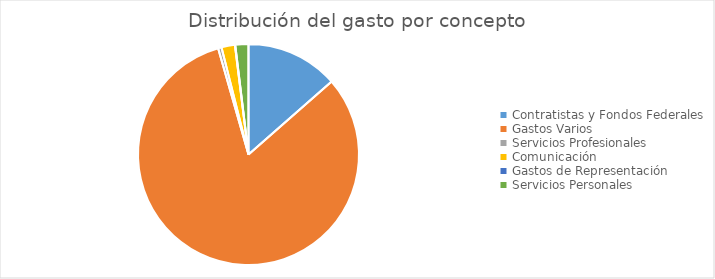
| Category | Series 0 |
|---|---|
| Contratistas y Fondos Federales | 61150625.74 |
| Gastos Varios | 370549439.88 |
| Servicios Profesionales | 2281195.2 |
| Comunicación | 8882409.05 |
| Gastos de Representación | 217814.54 |
| Servicios Personales | 8668247.8 |